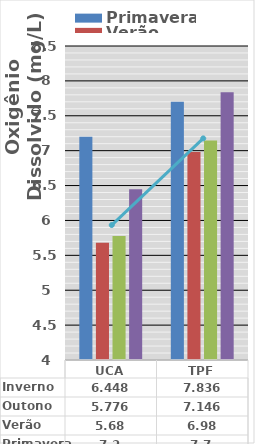
| Category | Primavera | Verão | Outono | Inverno |
|---|---|---|---|---|
| UCA | 7.2 | 5.68 | 5.776 | 6.448 |
| TPF | 7.7 | 6.98 | 7.146 | 7.836 |